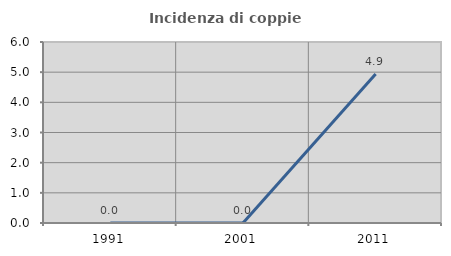
| Category | Incidenza di coppie miste |
|---|---|
| 1991.0 | 0 |
| 2001.0 | 0 |
| 2011.0 | 4.938 |